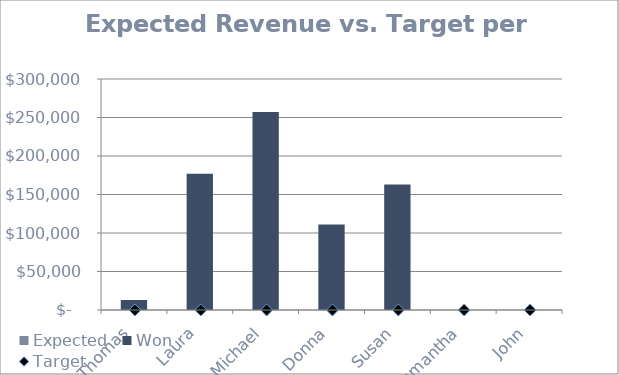
| Category | Won | Expected |
|---|---|---|
| Thomas | 13000 | 114250 |
| Laura | 177000 | 246250 |
| Michael | 257000 | 260350 |
| Donna | 111000 | 242550 |
| Susan | 163000 | 211500 |
| Samantha | 0 | 39500 |
| John | 0 | 0 |